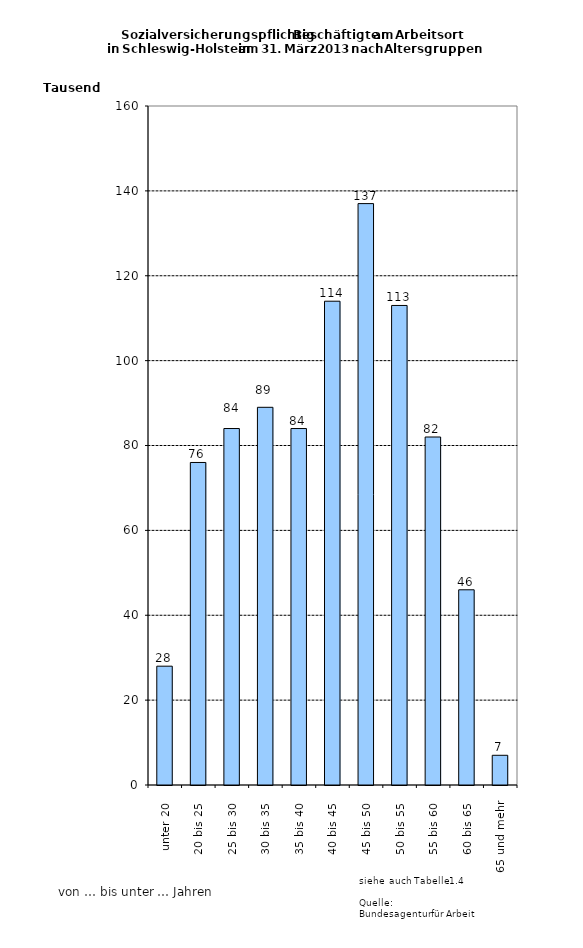
| Category | Series 0 |
|---|---|
| unter 20 | 28000 |
| 20 bis 25 | 76000 |
| 25 bis 30 | 84000 |
| 30 bis 35 | 89000 |
| 35 bis 40 | 84000 |
| 40 bis 45 | 114000 |
| 45 bis 50 | 137000 |
| 50 bis 55 | 113000 |
| 55 bis 60 | 82000 |
| 60 bis 65 | 46000 |
| 65 und mehr | 7000 |